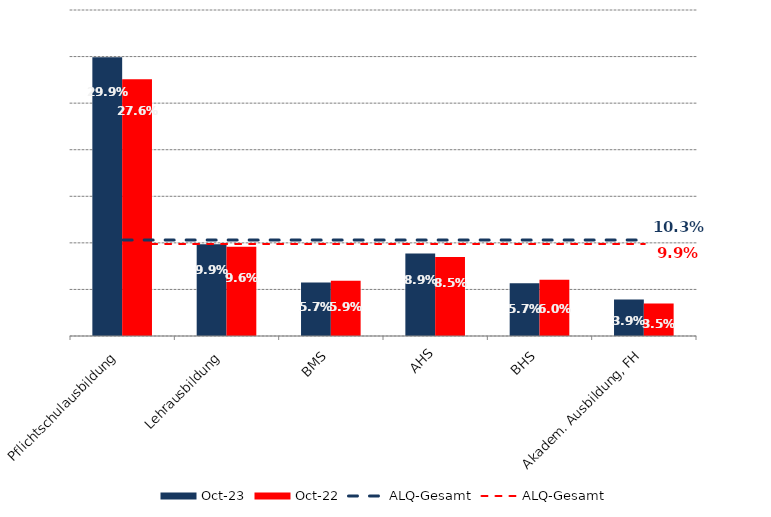
| Category | Okt 23 | Okt 22 |
|---|---|---|
| Pflichtschulausbildung | 0.299 | 0.276 |
| Lehrausbildung | 0.099 | 0.096 |
| BMS | 0.057 | 0.059 |
| AHS | 0.089 | 0.085 |
| BHS | 0.057 | 0.06 |
| Akadem. Ausbildung, FH | 0.039 | 0.035 |